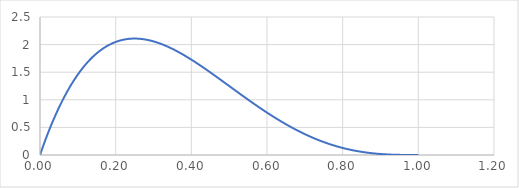
| Category | Series 0 |
|---|---|
| 0.0 | 0 |
| 0.01 | 0.194 |
| 0.02 | 0.376 |
| 0.03 | 0.548 |
| 0.04 | 0.708 |
| 0.05 | 0.857 |
| 0.06 | 0.997 |
| 0.07 | 1.126 |
| 0.08 | 1.246 |
| 0.09 | 1.356 |
| 0.1 | 1.458 |
| 0.11 | 1.551 |
| 0.12 | 1.636 |
| 0.13 | 1.712 |
| 0.14 | 1.781 |
| 0.15 | 1.842 |
| 0.16 | 1.897 |
| 0.17 | 1.944 |
| 0.18 | 1.985 |
| 0.19 | 2.019 |
| 0.2 | 2.048 |
| 0.21 | 2.071 |
| 0.22 | 2.088 |
| 0.23 | 2.1 |
| 0.24 | 2.107 |
| 0.25 | 2.109 |
| 0.26 | 2.107 |
| 0.27 | 2.101 |
| 0.28 | 2.09 |
| 0.29 | 2.076 |
| 0.3 | 2.058 |
| 0.31 | 2.037 |
| 0.32 | 2.012 |
| 0.33 | 1.985 |
| 0.34 | 1.955 |
| 0.35 | 1.922 |
| 0.36 | 1.887 |
| 0.37 | 1.85 |
| 0.38 | 1.811 |
| 0.39 | 1.77 |
| 0.4 | 1.728 |
| 0.41 | 1.684 |
| 0.42 | 1.639 |
| 0.43 | 1.593 |
| 0.44 | 1.545 |
| 0.45 | 1.497 |
| 0.46 | 1.449 |
| 0.47 | 1.399 |
| 0.48 | 1.35 |
| 0.49 | 1.3 |
| 0.5 | 1.25 |
| 0.51 | 1.2 |
| 0.52 | 1.15 |
| 0.53 | 1.101 |
| 0.54 | 1.051 |
| 0.55 | 1.002 |
| 0.56 | 0.954 |
| 0.57 | 0.906 |
| 0.58 | 0.859 |
| 0.59 | 0.813 |
| 0.6 | 0.768 |
| 0.61 | 0.724 |
| 0.62 | 0.68 |
| 0.63 | 0.638 |
| 0.64 | 0.597 |
| 0.65 | 0.557 |
| 0.66 | 0.519 |
| 0.67 | 0.482 |
| 0.68 | 0.446 |
| 0.69 | 0.411 |
| 0.7 | 0.378 |
| 0.71 | 0.346 |
| 0.72 | 0.316 |
| 0.73 | 0.287 |
| 0.74 | 0.26 |
| 0.75 | 0.234 |
| 0.76 | 0.21 |
| 0.77 | 0.187 |
| 0.78 | 0.166 |
| 0.79 | 0.146 |
| 0.8 | 0.128 |
| 0.81 | 0.111 |
| 0.82 | 0.096 |
| 0.83 | 0.082 |
| 0.84 | 0.069 |
| 0.85 | 0.057 |
| 0.86 | 0.047 |
| 0.87 | 0.038 |
| 0.88 | 0.03 |
| 0.89 | 0.024 |
| 0.9 | 0.018 |
| 0.91 | 0.013 |
| 0.92 | 0.009 |
| 0.93 | 0.006 |
| 0.94 | 0.004 |
| 0.95 | 0.002 |
| 0.96 | 0.001 |
| 0.97 | 0.001 |
| 0.98 | 0 |
| 0.99 | 0 |
| 1.0 | 0 |